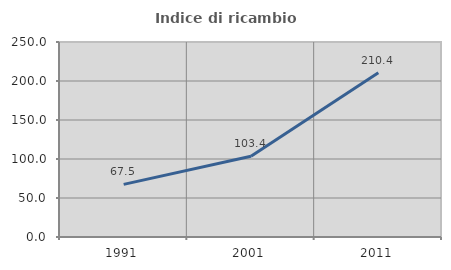
| Category | Indice di ricambio occupazionale  |
|---|---|
| 1991.0 | 67.506 |
| 2001.0 | 103.427 |
| 2011.0 | 210.442 |